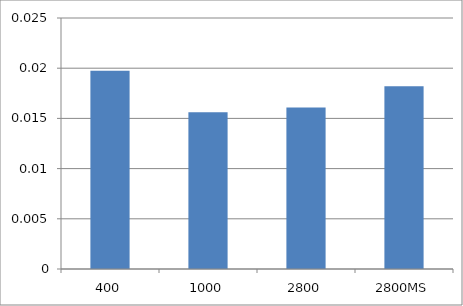
| Category | Series 0 |
|---|---|
| 400 | 0.02 |
| 1000 | 0.016 |
| 2800 | 0.016 |
| 2800MS | 0.018 |